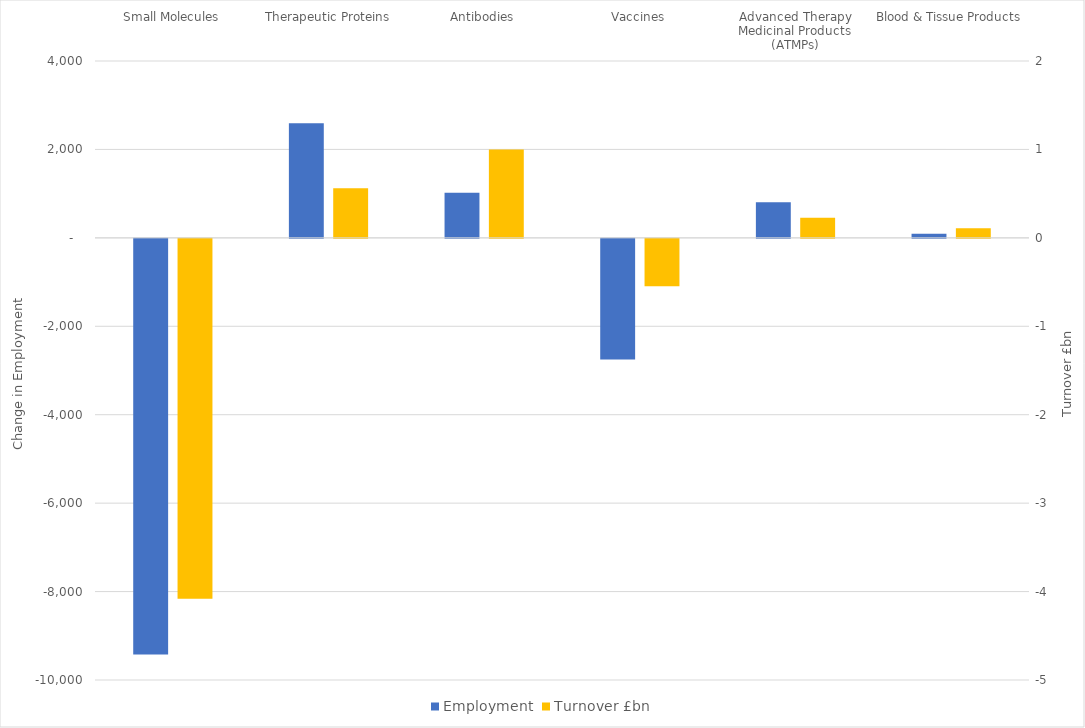
| Category | Employment | Series 1 |
|---|---|---|
| Small Molecules | -9400 |  |
| Therapeutic Proteins | 2592 |  |
| Antibodies | 1023 |  |
| Vaccines | -2729 |  |
| Advanced Therapy Medicinal Products (ATMPs) | 805 |  |
| Blood & Tissue Products | 94 |  |